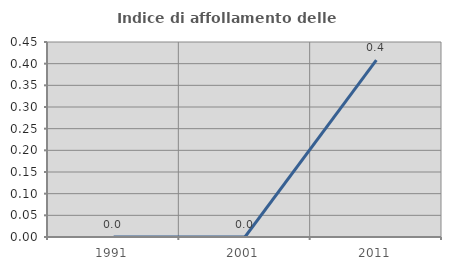
| Category | Indice di affollamento delle abitazioni  |
|---|---|
| 1991.0 | 0 |
| 2001.0 | 0 |
| 2011.0 | 0.408 |